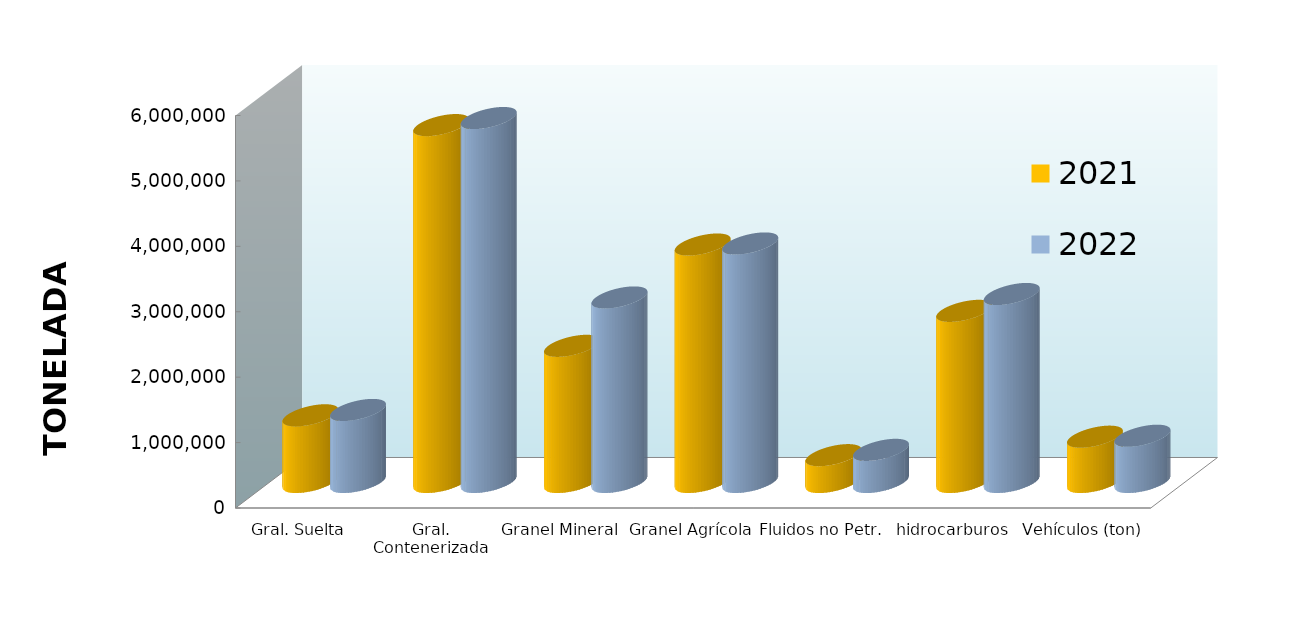
| Category | 2021 | 2022 |
|---|---|---|
| Gral. Suelta | 1019521.905 | 1101161.357 |
| Gral. Contenerizada | 5455816.612 | 5563889.921 |
| Granel Mineral | 2081530.044 | 2821111.196 |
| Granel Agrícola | 3630091.818 | 3646590.266 |
| Fluidos no Petr. | 410177.021 | 491221.949 |
| hidrocarburos | 2616024.518 | 2873898.946 |
| Vehículos (ton) | 692690.615 | 707264.541 |